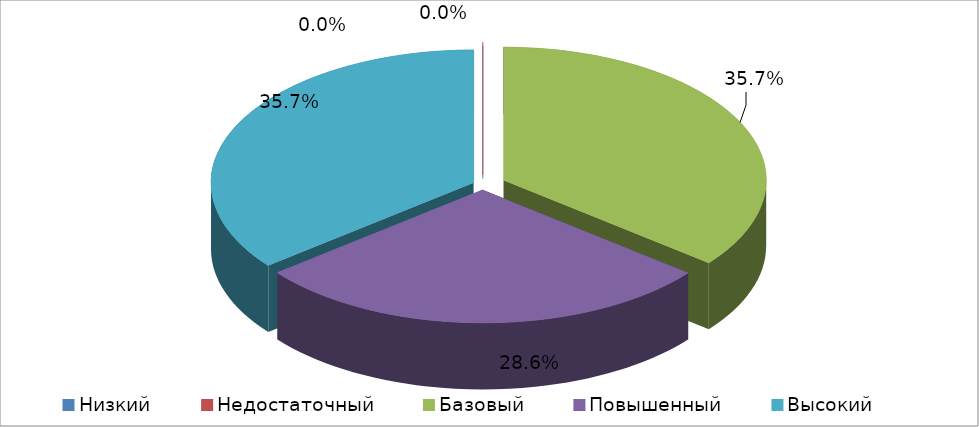
| Category | Series 0 |
|---|---|
| Низкий | 0 |
| Недостаточный | 0 |
| Базовый | 0.357 |
| Повышенный | 0.286 |
| Высокий | 0.357 |